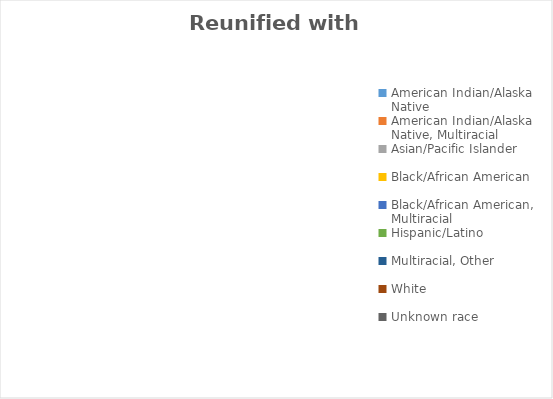
| Category | Reunified with child(ren) |
|---|---|
| American Indian/Alaska Native  | 0 |
| American Indian/Alaska Native, Multiracial | 0 |
| Asian/Pacific Islander | 0 |
| Black/African American | 0 |
| Black/African American, Multiracial | 0 |
| Hispanic/Latino  | 0 |
| Multiracial, Other | 0 |
| White  | 0 |
| Unknown race | 0 |